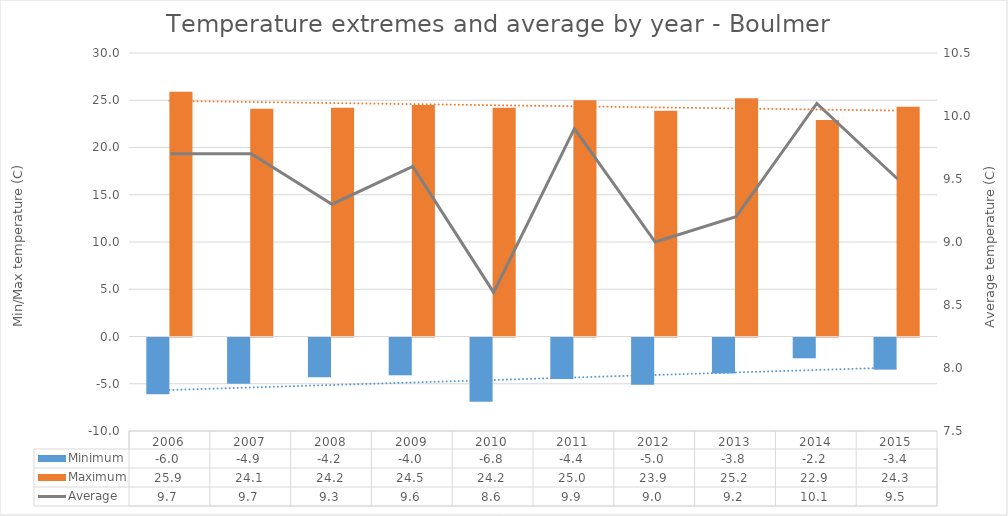
| Category | Minimum | Maximum |
|---|---|---|
| 2006 | -6 | 25.9 |
| 2007 | -4.9 | 24.1 |
| 2008 | -4.2 | 24.2 |
| 2009 | -4 | 24.5 |
| 2010 | -6.8 | 24.2 |
| 2011 | -4.4 | 25 |
| 2012 | -5 | 23.9 |
| 2013 | -3.8 | 25.2 |
| 2014 | -2.2 | 22.9 |
| 2015 | -3.4 | 24.3 |